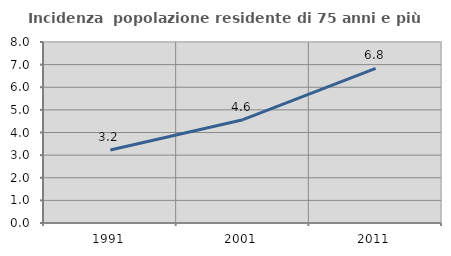
| Category | Incidenza  popolazione residente di 75 anni e più |
|---|---|
| 1991.0 | 3.229 |
| 2001.0 | 4.566 |
| 2011.0 | 6.838 |